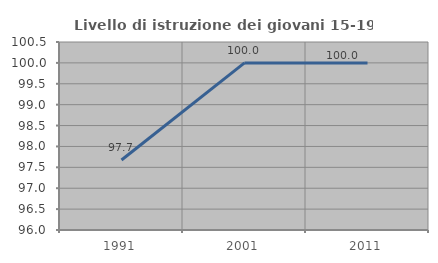
| Category | Livello di istruzione dei giovani 15-19 anni |
|---|---|
| 1991.0 | 97.674 |
| 2001.0 | 100 |
| 2011.0 | 100 |